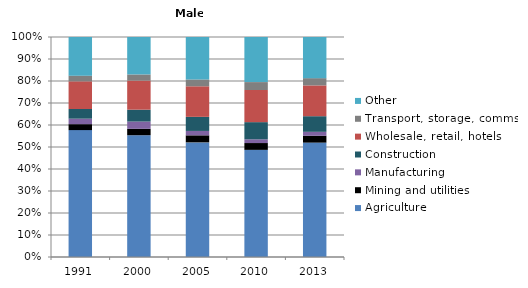
| Category | Agriculture | Mining and utilities | Manufacturing | Construction | Wholesale, retail, hotels | Transport, storage, comms | Other |
|---|---|---|---|---|---|---|---|
| 1991.0 | 57.8 | 2.7 | 2.5 | 4.4 | 12.6 | 2.6 | 17.6 |
| 2000.0 | 55.3 | 2.9 | 3.3 | 5.4 | 13.2 | 2.8 | 17 |
| 2005.0 | 52.1 | 3.2 | 2 | 6.4 | 13.9 | 3.1 | 19.3 |
| 2010.0 | 48.7 | 3.1 | 1.7 | 7.8 | 14.6 | 3.6 | 20.5 |
| 2013.0 | 52 | 3.1 | 1.8 | 7.1 | 14 | 3.3 | 18.7 |